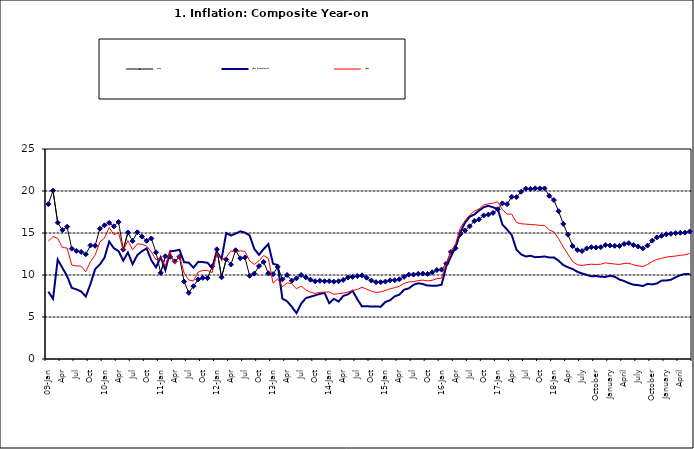
| Category | Food | All Items less Farm Produce | All Items |
|---|---|---|---|
| 09-Jan | 18.436 | 8.013 | 14.034 |
| Feb | 20.041 | 7.178 | 14.584 |
| Mar | 16.233 | 11.842 | 14.366 |
| Apr | 15.342 | 10.85 | 13.268 |
| May | 15.74 | 9.88 | 13.212 |
| June | 13.138 | 8.472 | 11.194 |
| Jul | 12.867 | 8.285 | 11.09 |
| Aug | 12.746 | 8.044 | 11.046 |
| Sep | 12.472 | 7.431 | 10.39 |
| Oct | 13.524 | 8.933 | 11.588 |
| Nov | 13.482 | 10.702 | 12.368 |
| Dec | 15.518 | 11.249 | 13.93 |
| 10-Jan | 15.918 | 12.063 | 14.398 |
| Feb | 16.208 | 13.978 | 15.649 |
| Mar | 15.79 | 13.184 | 14.812 |
| Apr | 16.306 | 12.844 | 15.044 |
| May | 13.023 | 11.711 | 12.915 |
| Jun | 15.053 | 12.686 | 14.099 |
| Jul | 14.043 | 11.287 | 13.002 |
| Aug | 15.09 | 12.366 | 13.702 |
| Sep | 14.57 | 12.83 | 13.65 |
| Oct | 14.065 | 13.168 | 13.45 |
| Nov | 14.351 | 11.746 | 12.766 |
| Dec | 12.701 | 10.917 | 11.815 |
| 11-Jan | 10.255 | 12.118 | 12.08 |
| Feb | 12.221 | 10.569 | 11.1 |
| Mar | 12.169 | 12.815 | 12.779 |
| Apr | 11.629 | 12.882 | 11.291 |
| May | 12.179 | 13.006 | 12.352 |
| Jun | 9.22 | 11.524 | 10.23 |
| Jul | 7.877 | 11.472 | 9.397 |
| Aug | 8.665 | 10.863 | 9.301 |
| Sep | 9.479 | 11.567 | 10.339 |
| Oct | 9.656 | 11.539 | 10.544 |
| Nov | 9.623 | 11.459 | 10.54 |
| Dec | 11.02 | 10.822 | 10.283 |
| 12-Jan | 13.053 | 12.748 | 12.626 |
| 12-Feb | 9.729 | 11.901 | 11.866 |
| 12-Mar | 11.848 | 14.995 | 12.111 |
| Apr | 11.246 | 14.703 | 12.866 |
| May | 12.942 | 14.926 | 12.688 |
| Jun | 11.991 | 15.199 | 12.892 |
| Jul | 12.093 | 15.045 | 12.797 |
| Aug | 9.91 | 14.714 | 11.689 |
| Sep | 10.164 | 13.101 | 11.253 |
| Oct | 11.064 | 12.398 | 11.693 |
| Nov | 11.553 | 13.092 | 12.32 |
| Dec | 10.199 | 13.685 | 11.981 |
| 13-Jan | 10.106 | 11.342 | 9.031 |
| Feb | 10.973 | 11.184 | 9.542 |
| Mar | 9.482 | 7.179 | 8.593 |
| Apr | 10.006 | 6.874 | 9.052 |
| May | 9.321 | 6.227 | 8.964 |
| Jun | 9.606 | 5.472 | 8.353 |
| Jul | 9.994 | 6.58 | 8.682 |
| Aug | 9.723 | 7.245 | 8.231 |
| Sep | 9.437 | 7.41 | 7.952 |
| Oct | 9.249 | 7.579 | 7.807 |
| Nov | 9.313 | 7.75 | 7.931 |
| Dec | 9.253 | 7.872 | 7.957 |
| 14-Jan | 9.271 | 6.648 | 7.977 |
| Feb | 9.207 | 7.166 | 7.707 |
| Mar | 9.254 | 6.836 | 7.783 |
| Apr | 9.414 | 7.508 | 7.851 |
| May | 9.698 | 7.693 | 7.965 |
| Jun | 9.776 | 8.122 | 8.167 |
| Jul | 9.878 | 7.116 | 8.281 |
| Aug | 9.959 | 6.264 | 8.534 |
| Sep | 9.676 | 6.278 | 8.317 |
| Oct | 9.343 | 6.252 | 8.06 |
| Nov | 9.144 | 6.255 | 7.927 |
| Dec | 9.152 | 6.225 | 7.978 |
| 15-Jan | 9.215 | 6.787 | 8.157 |
| Feb | 9.359 | 6.994 | 8.359 |
| Mar | 9.376 | 7.46 | 8.494 |
| Apr | 9.49 | 7.661 | 8.655 |
| May | 9.782 | 8.253 | 9.003 |
| Jun | 10.041 | 8.403 | 9.168 |
| Jul | 10.049 | 8.83 | 9.218 |
| Aug | 10.131 | 9.01 | 9.336 |
| Sep | 10.174 | 8.928 | 9.394 |
| Oct | 10.129 | 8.742 | 9.296 |
| Nov | 10.321 | 8.732 | 9.368 |
| Dec | 10.588 | 8.727 | 9.554 |
| 16-Jan | 10.642 | 8.841 | 9.617 |
| Feb | 11.348 | 11.041 | 11.379 |
| Mar | 12.745 | 12.17 | 12.775 |
| Apr | 13.194 | 13.352 | 13.721 |
| May | 14.861 | 15.054 | 15.577 |
| Jun | 15.302 | 16.224 | 16.48 |
| Jul | 15.799 | 16.929 | 17.127 |
| Aug | 16.427 | 17.208 | 17.609 |
| Sep | 16.622 | 17.666 | 17.852 |
| Oct | 17.09 | 18.067 | 18.33 |
| Nov | 17.191 | 18.241 | 18.476 |
| Dec | 17.388 | 18.052 | 18.547 |
| 17-Jan | 17.818 | 17.867 | 18.719 |
| Feb | 18.528 | 16.011 | 17.78 |
| Mar | 18.436 | 15.404 | 17.256 |
| Apr | 19.303 | 14.75 | 17.244 |
| May | 19.266 | 13.016 | 16.251 |
| Jun | 19.915 | 12.455 | 16.098 |
| Jul | 20.284 | 12.207 | 16.053 |
| Aug | 20.251 | 12.296 | 16.012 |
| Sep | 20.321 | 12.123 | 15.979 |
| Oct | 20.306 | 12.142 | 15.905 |
| Nov | 20.308 | 12.206 | 15.901 |
| Dec | 19.415 | 12.089 | 15.372 |
| 18-Jan | 18.919 | 12.09 | 15.127 |
| Feb | 17.588 | 11.707 | 14.33 |
| Mar | 16.08 | 11.181 | 13.337 |
| Apr | 14.799 | 10.92 | 12.482 |
| May | 13.448 | 10.71 | 11.608 |
| June | 12.977 | 10.387 | 11.231 |
| July | 12.85 | 10.183 | 11.142 |
| August | 13.158 | 10.015 | 11.227 |
| September | 13.309 | 9.838 | 11.284 |
| October | 13.277 | 9.882 | 11.259 |
| November | 13.301 | 9.787 | 11.281 |
| December | 13.559 | 9.771 | 11.442 |
| January | 13.505 | 9.91 | 11.374 |
| February | 13.473 | 9.8 | 11.306 |
| March | 13.451 | 9.461 | 11.251 |
| April | 13.701 | 9.28 | 11.372 |
| May | 13.794 | 9.033 | 11.396 |
| June | 13.558 | 8.841 | 11.217 |
| July | 13.392 | 8.798 | 11.084 |
| August | 13.17 | 8.678 | 11.016 |
| September | 13.507 | 8.945 | 11.244 |
| October | 14.088 | 8.876 | 11.607 |
| November | 14.482 | 8.993 | 11.854 |
| December | 14.667 | 9.331 | 11.982 |
| January | 14.849 | 9.349 | 12.132 |
| February | 14.904 | 9.434 | 12.199 |
| March | 14.977 | 9.732 | 12.257 |
| April | 15.026 | 9.979 | 12.341 |
| May | 15.036 | 10.12 | 12.404 |
| June | 15.175 | 10.128 | 12.559 |